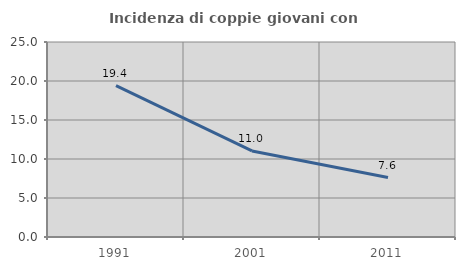
| Category | Incidenza di coppie giovani con figli |
|---|---|
| 1991.0 | 19.396 |
| 2001.0 | 11.033 |
| 2011.0 | 7.619 |